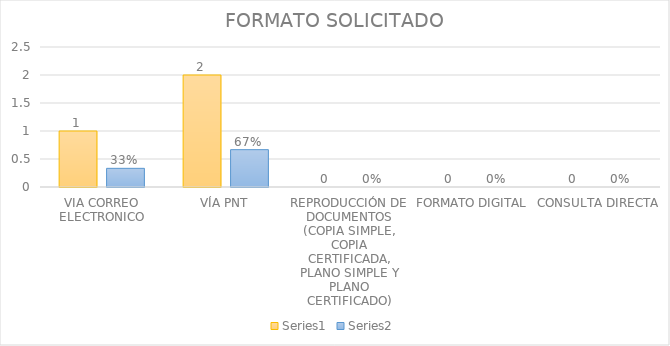
| Category | Series 3 | Series 4 |
|---|---|---|
| VIA CORREO ELECTRONICO | 1 | 0.333 |
| VÍA PNT | 2 | 0.667 |
| REPRODUCCIÓN DE DOCUMENTOS (COPIA SIMPLE, COPIA CERTIFICADA, PLANO SIMPLE Y PLANO CERTIFICADO) | 0 | 0 |
| FORMATO DIGITAL | 0 | 0 |
| CONSULTA DIRECTA | 0 | 0 |